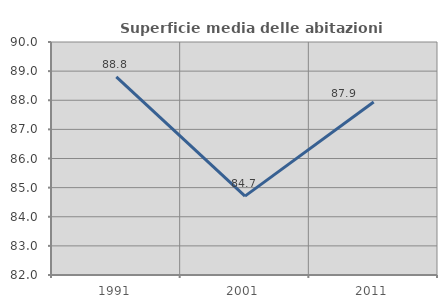
| Category | Superficie media delle abitazioni occupate |
|---|---|
| 1991.0 | 88.802 |
| 2001.0 | 84.707 |
| 2011.0 | 87.941 |